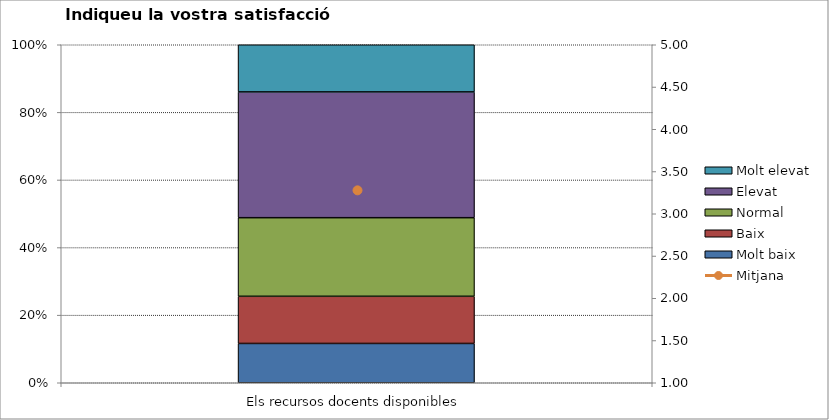
| Category | Molt baix | Baix | Normal  | Elevat | Molt elevat |
|---|---|---|---|---|---|
| Els recursos docents disponibles | 5 | 6 | 10 | 16 | 6 |